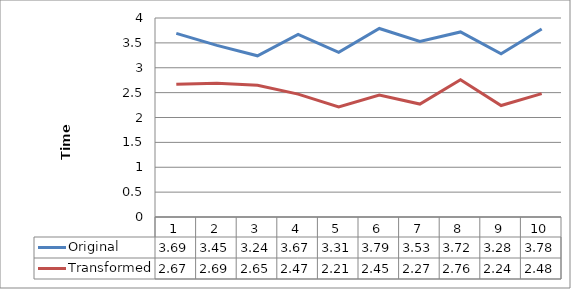
| Category | Original | Transformed |
|---|---|---|
| 0 | 3.69 | 2.67 |
| 1 | 3.45 | 2.69 |
| 2 | 3.24 | 2.65 |
| 3 | 3.67 | 2.47 |
| 4 | 3.31 | 2.21 |
| 5 | 3.79 | 2.45 |
| 6 | 3.53 | 2.27 |
| 7 | 3.72 | 2.76 |
| 8 | 3.28 | 2.24 |
| 9 | 3.78 | 2.48 |